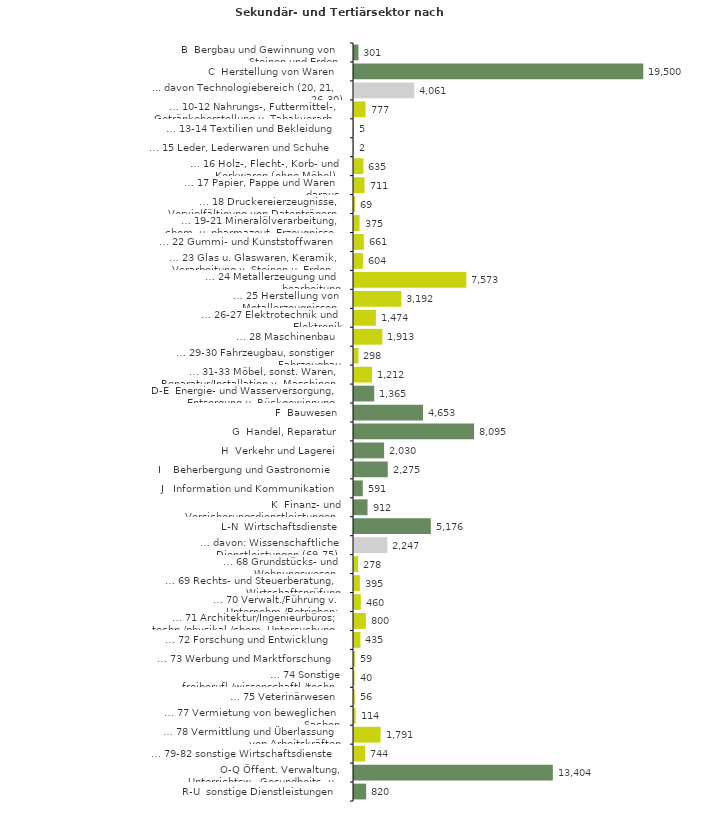
| Category | Series 0 |
|---|---|
| B  Bergbau und Gewinnung von Steinen und Erden | 301 |
| C  Herstellung von Waren | 19500 |
| ... davon Technologiebereich (20, 21, 26-30) | 4061 |
| … 10-12 Nahrungs-, Futtermittel-, Getränkeherstellung u. Tabakverarb. | 777 |
| … 13-14 Textilien und Bekleidung | 5 |
| … 15 Leder, Lederwaren und Schuhe | 2 |
| … 16 Holz-, Flecht-, Korb- und Korkwaren (ohne Möbel)  | 635 |
| … 17 Papier, Pappe und Waren daraus  | 711 |
| … 18 Druckereierzeugnisse, Vervielfältigung von Datenträgern | 69 |
| … 19-21 Mineralölverarbeitung, chem. u. pharmazeut. Erzeugnisse | 375 |
| … 22 Gummi- und Kunststoffwaren | 661 |
| … 23 Glas u. Glaswaren, Keramik, Verarbeitung v. Steinen u. Erden  | 604 |
| … 24 Metallerzeugung und -bearbeitung | 7573 |
| … 25 Herstellung von Metallerzeugnissen  | 3192 |
| … 26-27 Elektrotechnik und Elektronik | 1474 |
| … 28 Maschinenbau | 1913 |
| … 29-30 Fahrzeugbau, sonstiger Fahrzeugbau | 298 |
| … 31-33 Möbel, sonst. Waren, Reparatur/Installation v. Maschinen | 1212 |
| D-E  Energie- und Wasserversorgung, Entsorgung u. Rückgewinnung | 1365 |
| F  Bauwesen | 4653 |
| G  Handel, Reparatur | 8095 |
| H  Verkehr und Lagerei | 2030 |
| I    Beherbergung und Gastronomie | 2275 |
| J   Information und Kommunikation | 591 |
| K  Finanz- und Versicherungsdienstleistungen | 912 |
| L-N  Wirtschaftsdienste | 5176 |
| … davon: Wissenschaftliche Dienstleistungen (69-75) | 2247 |
| … 68 Grundstücks- und Wohnungswesen  | 278 |
| … 69 Rechts- und Steuerberatung, Wirtschaftsprüfung | 395 |
| … 70 Verwalt./Führung v. Unternehm./Betrieben; Unternehmensberat. | 460 |
| … 71 Architektur/Ingenieurbüros; techn./physikal./chem. Untersuchung | 800 |
| … 72 Forschung und Entwicklung  | 435 |
| … 73 Werbung und Marktforschung | 59 |
| … 74 Sonstige freiberufl./wissenschaftl./techn. Tätigkeiten | 40 |
| … 75 Veterinärwesen | 56 |
| … 77 Vermietung von beweglichen Sachen  | 114 |
| … 78 Vermittlung und Überlassung von Arbeitskräften | 1791 |
| … 79-82 sonstige Wirtschaftsdienste | 744 |
| O-Q Öffent. Verwaltung, Unterrichtsw., Gesundheits- u. Sozialwesen | 13404 |
| R-U  sonstige Dienstleistungen | 820 |